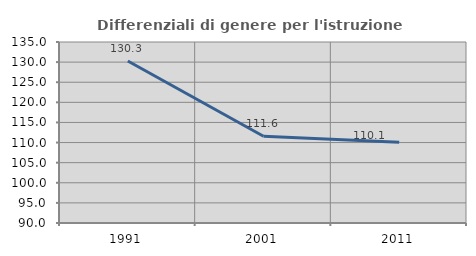
| Category | Differenziali di genere per l'istruzione superiore |
|---|---|
| 1991.0 | 130.261 |
| 2001.0 | 111.561 |
| 2011.0 | 110.055 |